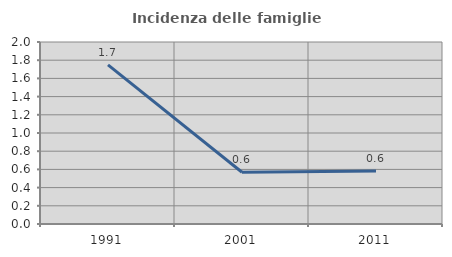
| Category | Incidenza delle famiglie numerose |
|---|---|
| 1991.0 | 1.749 |
| 2001.0 | 0.569 |
| 2011.0 | 0.583 |